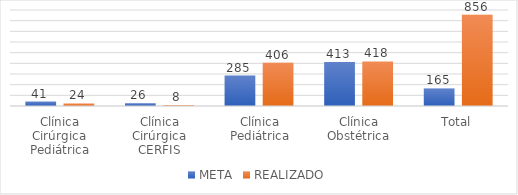
| Category | META | REALIZADO |
|---|---|---|
| Clínica Cirúrgica Pediátrica | 41 | 24 |
| Clínica Cirúrgica CERFIS | 26 | 8 |
| Clínica Pediátrica | 285 | 406 |
| Clínica Obstétrica | 413 | 418 |
| Total | 165 | 856 |